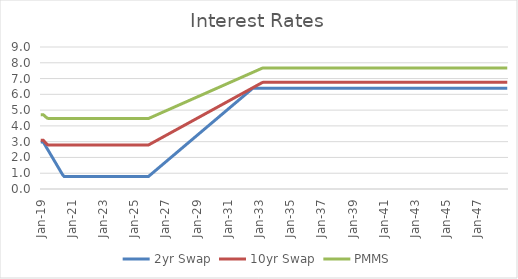
| Category | 2yr Swap | 10yr Swap | PMMS |
|---|---|---|---|
| 2019-01-31 | 2.979 | 3.089 | 4.71 |
| 2019-02-28 | 2.979 | 3.089 | 4.71 |
| 2019-03-31 | 2.979 | 3.089 | 4.71 |
| 2019-04-30 | 2.839 | 2.999 | 4.637 |
| 2019-05-31 | 2.7 | 2.908 | 4.564 |
| 2019-06-30 | 2.561 | 2.818 | 4.491 |
| 2019-07-31 | 2.421 | 2.792 | 4.47 |
| 2019-08-31 | 2.282 | 2.792 | 4.47 |
| 2019-09-30 | 2.143 | 2.792 | 4.47 |
| 2019-10-31 | 2.003 | 2.792 | 4.47 |
| 2019-11-30 | 1.864 | 2.792 | 4.47 |
| 2019-12-31 | 1.725 | 2.792 | 4.469 |
| 2020-01-31 | 1.585 | 2.792 | 4.469 |
| 2020-02-29 | 1.446 | 2.792 | 4.469 |
| 2020-03-31 | 1.307 | 2.792 | 4.469 |
| 2020-04-30 | 1.167 | 2.792 | 4.469 |
| 2020-05-31 | 1.028 | 2.792 | 4.469 |
| 2020-06-30 | 0.889 | 2.792 | 4.469 |
| 2020-07-31 | 0.798 | 2.792 | 4.469 |
| 2020-08-31 | 0.798 | 2.792 | 4.469 |
| 2020-09-30 | 0.798 | 2.792 | 4.469 |
| 2020-10-31 | 0.798 | 2.792 | 4.469 |
| 2020-11-30 | 0.798 | 2.792 | 4.469 |
| 2020-12-31 | 0.798 | 2.792 | 4.469 |
| 2021-01-31 | 0.798 | 2.792 | 4.469 |
| 2021-02-28 | 0.798 | 2.792 | 4.469 |
| 2021-03-31 | 0.798 | 2.792 | 4.469 |
| 2021-04-30 | 0.798 | 2.792 | 4.469 |
| 2021-05-31 | 0.798 | 2.792 | 4.469 |
| 2021-06-30 | 0.798 | 2.792 | 4.469 |
| 2021-07-31 | 0.798 | 2.792 | 4.469 |
| 2021-08-31 | 0.798 | 2.792 | 4.469 |
| 2021-09-30 | 0.798 | 2.792 | 4.469 |
| 2021-10-31 | 0.798 | 2.792 | 4.469 |
| 2021-11-30 | 0.798 | 2.792 | 4.469 |
| 2021-12-31 | 0.798 | 2.792 | 4.469 |
| 2022-01-31 | 0.798 | 2.792 | 4.469 |
| 2022-02-28 | 0.798 | 2.792 | 4.469 |
| 2022-03-31 | 0.798 | 2.792 | 4.469 |
| 2022-04-30 | 0.798 | 2.792 | 4.469 |
| 2022-05-31 | 0.798 | 2.792 | 4.469 |
| 2022-06-30 | 0.798 | 2.792 | 4.469 |
| 2022-07-31 | 0.798 | 2.792 | 4.469 |
| 2022-08-31 | 0.798 | 2.792 | 4.469 |
| 2022-09-30 | 0.798 | 2.792 | 4.469 |
| 2022-10-31 | 0.798 | 2.792 | 4.469 |
| 2022-11-30 | 0.798 | 2.792 | 4.469 |
| 2022-12-31 | 0.798 | 2.792 | 4.469 |
| 2023-01-31 | 0.798 | 2.792 | 4.469 |
| 2023-02-28 | 0.798 | 2.792 | 4.469 |
| 2023-03-31 | 0.798 | 2.792 | 4.469 |
| 2023-04-30 | 0.798 | 2.792 | 4.469 |
| 2023-05-31 | 0.798 | 2.792 | 4.469 |
| 2023-06-30 | 0.798 | 2.792 | 4.469 |
| 2023-07-31 | 0.798 | 2.792 | 4.469 |
| 2023-08-31 | 0.798 | 2.792 | 4.469 |
| 2023-09-30 | 0.798 | 2.792 | 4.469 |
| 2023-10-31 | 0.798 | 2.792 | 4.469 |
| 2023-11-30 | 0.798 | 2.792 | 4.469 |
| 2023-12-31 | 0.798 | 2.792 | 4.469 |
| 2024-01-31 | 0.798 | 2.792 | 4.469 |
| 2024-02-29 | 0.798 | 2.792 | 4.469 |
| 2024-03-31 | 0.798 | 2.792 | 4.469 |
| 2024-04-30 | 0.798 | 2.792 | 4.469 |
| 2024-05-31 | 0.798 | 2.792 | 4.469 |
| 2024-06-30 | 0.798 | 2.792 | 4.469 |
| 2024-07-31 | 0.798 | 2.792 | 4.469 |
| 2024-08-31 | 0.798 | 2.792 | 4.469 |
| 2024-09-30 | 0.798 | 2.792 | 4.469 |
| 2024-10-31 | 0.798 | 2.792 | 4.469 |
| 2024-11-30 | 0.798 | 2.792 | 4.469 |
| 2024-12-31 | 0.798 | 2.792 | 4.469 |
| 2025-01-31 | 0.798 | 2.792 | 4.469 |
| 2025-02-28 | 0.798 | 2.792 | 4.469 |
| 2025-03-31 | 0.798 | 2.792 | 4.469 |
| 2025-04-30 | 0.798 | 2.792 | 4.469 |
| 2025-05-31 | 0.798 | 2.792 | 4.469 |
| 2025-06-30 | 0.798 | 2.792 | 4.469 |
| 2025-07-31 | 0.798 | 2.792 | 4.469 |
| 2025-08-31 | 0.798 | 2.792 | 4.469 |
| 2025-09-30 | 0.798 | 2.792 | 4.469 |
| 2025-10-31 | 0.798 | 2.792 | 4.469 |
| 2025-11-30 | 0.798 | 2.792 | 4.469 |
| 2025-12-31 | 0.798 | 2.792 | 4.469 |
| 2026-01-31 | 0.868 | 2.837 | 4.505 |
| 2026-02-28 | 0.938 | 2.882 | 4.542 |
| 2026-03-31 | 1.007 | 2.928 | 4.578 |
| 2026-04-30 | 1.077 | 2.973 | 4.615 |
| 2026-05-31 | 1.147 | 3.018 | 4.651 |
| 2026-06-30 | 1.216 | 3.063 | 4.688 |
| 2026-07-31 | 1.286 | 3.108 | 4.724 |
| 2026-08-31 | 1.356 | 3.154 | 4.761 |
| 2026-09-30 | 1.425 | 3.199 | 4.797 |
| 2026-10-31 | 1.495 | 3.244 | 4.834 |
| 2026-11-30 | 1.565 | 3.289 | 4.87 |
| 2026-12-31 | 1.634 | 3.334 | 4.906 |
| 2027-01-31 | 1.704 | 3.38 | 4.943 |
| 2027-02-28 | 1.774 | 3.425 | 4.979 |
| 2027-03-31 | 1.843 | 3.47 | 5.016 |
| 2027-04-30 | 1.913 | 3.515 | 5.052 |
| 2027-05-31 | 1.983 | 3.561 | 5.089 |
| 2027-06-30 | 2.052 | 3.606 | 5.125 |
| 2027-07-31 | 2.122 | 3.651 | 5.162 |
| 2027-08-31 | 2.192 | 3.696 | 5.198 |
| 2027-09-30 | 2.261 | 3.741 | 5.235 |
| 2027-10-31 | 2.331 | 3.787 | 5.271 |
| 2027-11-30 | 2.401 | 3.832 | 5.308 |
| 2027-12-31 | 2.47 | 3.877 | 5.344 |
| 2028-01-31 | 2.54 | 3.922 | 5.381 |
| 2028-02-29 | 2.61 | 3.968 | 5.417 |
| 2028-03-31 | 2.679 | 4.013 | 5.454 |
| 2028-04-30 | 2.749 | 4.058 | 5.49 |
| 2028-05-31 | 2.819 | 4.103 | 5.527 |
| 2028-06-30 | 2.888 | 4.148 | 5.563 |
| 2028-07-31 | 2.958 | 4.194 | 5.6 |
| 2028-08-31 | 3.028 | 4.239 | 5.636 |
| 2028-09-30 | 3.097 | 4.284 | 5.673 |
| 2028-10-31 | 3.167 | 4.329 | 5.709 |
| 2028-11-30 | 3.237 | 4.375 | 5.746 |
| 2028-12-31 | 3.306 | 4.42 | 5.782 |
| 2029-01-31 | 3.376 | 4.465 | 5.818 |
| 2029-02-28 | 3.446 | 4.51 | 5.855 |
| 2029-03-31 | 3.515 | 4.555 | 5.891 |
| 2029-04-30 | 3.585 | 4.601 | 5.928 |
| 2029-05-31 | 3.655 | 4.646 | 5.964 |
| 2029-06-30 | 3.724 | 4.691 | 6.001 |
| 2029-07-31 | 3.794 | 4.736 | 6.037 |
| 2029-08-31 | 3.864 | 4.782 | 6.074 |
| 2029-09-30 | 3.933 | 4.827 | 6.11 |
| 2029-10-31 | 4.003 | 4.872 | 6.147 |
| 2029-11-30 | 4.073 | 4.917 | 6.183 |
| 2029-12-31 | 4.142 | 4.962 | 6.22 |
| 2030-01-31 | 4.212 | 5.008 | 6.256 |
| 2030-02-28 | 4.282 | 5.053 | 6.293 |
| 2030-03-31 | 4.351 | 5.098 | 6.329 |
| 2030-04-30 | 4.421 | 5.143 | 6.366 |
| 2030-05-31 | 4.491 | 5.189 | 6.402 |
| 2030-06-30 | 4.56 | 5.234 | 6.439 |
| 2030-07-31 | 4.63 | 5.279 | 6.475 |
| 2030-08-31 | 4.7 | 5.324 | 6.512 |
| 2030-09-30 | 4.769 | 5.369 | 6.548 |
| 2030-10-31 | 4.839 | 5.415 | 6.585 |
| 2030-11-30 | 4.909 | 5.46 | 6.621 |
| 2030-12-31 | 4.978 | 5.505 | 6.658 |
| 2031-01-31 | 5.048 | 5.55 | 6.694 |
| 2031-02-28 | 5.118 | 5.596 | 6.73 |
| 2031-03-31 | 5.187 | 5.641 | 6.767 |
| 2031-04-30 | 5.257 | 5.686 | 6.803 |
| 2031-05-31 | 5.327 | 5.731 | 6.84 |
| 2031-06-30 | 5.396 | 5.776 | 6.876 |
| 2031-07-31 | 5.466 | 5.822 | 6.913 |
| 2031-08-31 | 5.536 | 5.867 | 6.949 |
| 2031-09-30 | 5.605 | 5.912 | 6.986 |
| 2031-10-31 | 5.675 | 5.957 | 7.022 |
| 2031-11-30 | 5.745 | 6.003 | 7.059 |
| 2031-12-31 | 5.814 | 6.048 | 7.095 |
| 2032-01-31 | 5.884 | 6.093 | 7.132 |
| 2032-02-29 | 5.954 | 6.138 | 7.168 |
| 2032-03-31 | 6.023 | 6.183 | 7.205 |
| 2032-04-30 | 6.093 | 6.229 | 7.241 |
| 2032-05-31 | 6.163 | 6.274 | 7.278 |
| 2032-06-30 | 6.232 | 6.319 | 7.314 |
| 2032-07-31 | 6.302 | 6.364 | 7.351 |
| 2032-08-31 | 6.372 | 6.409 | 7.387 |
| 2032-09-30 | 6.387 | 6.455 | 7.424 |
| 2032-10-31 | 6.387 | 6.5 | 7.46 |
| 2032-11-30 | 6.387 | 6.545 | 7.496 |
| 2032-12-31 | 6.387 | 6.59 | 7.533 |
| 2033-01-31 | 6.387 | 6.636 | 7.569 |
| 2033-02-28 | 6.387 | 6.681 | 7.606 |
| 2033-03-31 | 6.387 | 6.726 | 7.642 |
| 2033-04-30 | 6.387 | 6.758 | 7.668 |
| 2033-05-31 | 6.387 | 6.758 | 7.668 |
| 2033-06-30 | 6.387 | 6.758 | 7.668 |
| 2033-07-31 | 6.387 | 6.758 | 7.668 |
| 2033-08-31 | 6.387 | 6.758 | 7.668 |
| 2033-09-30 | 6.387 | 6.758 | 7.668 |
| 2033-10-31 | 6.387 | 6.758 | 7.668 |
| 2033-11-30 | 6.387 | 6.758 | 7.668 |
| 2033-12-31 | 6.387 | 6.758 | 7.668 |
| 2034-01-31 | 6.387 | 6.758 | 7.668 |
| 2034-02-28 | 6.387 | 6.758 | 7.668 |
| 2034-03-31 | 6.387 | 6.758 | 7.668 |
| 2034-04-30 | 6.387 | 6.758 | 7.668 |
| 2034-05-31 | 6.387 | 6.758 | 7.668 |
| 2034-06-30 | 6.387 | 6.758 | 7.668 |
| 2034-07-31 | 6.387 | 6.758 | 7.668 |
| 2034-08-31 | 6.387 | 6.758 | 7.668 |
| 2034-09-30 | 6.387 | 6.758 | 7.668 |
| 2034-10-31 | 6.387 | 6.758 | 7.668 |
| 2034-11-30 | 6.387 | 6.758 | 7.668 |
| 2034-12-31 | 6.387 | 6.758 | 7.668 |
| 2035-01-31 | 6.387 | 6.758 | 7.668 |
| 2035-02-28 | 6.387 | 6.758 | 7.668 |
| 2035-03-31 | 6.387 | 6.758 | 7.668 |
| 2035-04-30 | 6.387 | 6.758 | 7.668 |
| 2035-05-31 | 6.387 | 6.758 | 7.668 |
| 2035-06-30 | 6.387 | 6.758 | 7.668 |
| 2035-07-31 | 6.387 | 6.758 | 7.668 |
| 2035-08-31 | 6.387 | 6.758 | 7.668 |
| 2035-09-30 | 6.387 | 6.758 | 7.668 |
| 2035-10-31 | 6.387 | 6.758 | 7.668 |
| 2035-11-30 | 6.387 | 6.758 | 7.668 |
| 2035-12-31 | 6.387 | 6.758 | 7.668 |
| 2036-01-31 | 6.387 | 6.758 | 7.668 |
| 2036-02-29 | 6.387 | 6.758 | 7.668 |
| 2036-03-31 | 6.387 | 6.758 | 7.668 |
| 2036-04-30 | 6.387 | 6.758 | 7.668 |
| 2036-05-31 | 6.387 | 6.758 | 7.668 |
| 2036-06-30 | 6.387 | 6.758 | 7.668 |
| 2036-07-31 | 6.387 | 6.758 | 7.668 |
| 2036-08-31 | 6.387 | 6.758 | 7.668 |
| 2036-09-30 | 6.387 | 6.758 | 7.668 |
| 2036-10-31 | 6.387 | 6.758 | 7.668 |
| 2036-11-30 | 6.387 | 6.758 | 7.668 |
| 2036-12-31 | 6.387 | 6.758 | 7.668 |
| 2037-01-31 | 6.387 | 6.758 | 7.668 |
| 2037-02-28 | 6.387 | 6.758 | 7.668 |
| 2037-03-31 | 6.387 | 6.758 | 7.668 |
| 2037-04-30 | 6.387 | 6.758 | 7.668 |
| 2037-05-31 | 6.387 | 6.758 | 7.668 |
| 2037-06-30 | 6.387 | 6.758 | 7.668 |
| 2037-07-31 | 6.387 | 6.758 | 7.668 |
| 2037-08-31 | 6.387 | 6.758 | 7.668 |
| 2037-09-30 | 6.387 | 6.758 | 7.668 |
| 2037-10-31 | 6.387 | 6.758 | 7.668 |
| 2037-11-30 | 6.387 | 6.758 | 7.668 |
| 2037-12-31 | 6.387 | 6.758 | 7.668 |
| 2038-01-31 | 6.387 | 6.758 | 7.668 |
| 2038-02-28 | 6.387 | 6.758 | 7.668 |
| 2038-03-31 | 6.387 | 6.758 | 7.668 |
| 2038-04-30 | 6.387 | 6.758 | 7.668 |
| 2038-05-31 | 6.387 | 6.758 | 7.668 |
| 2038-06-30 | 6.387 | 6.758 | 7.668 |
| 2038-07-31 | 6.387 | 6.758 | 7.668 |
| 2038-08-31 | 6.387 | 6.758 | 7.668 |
| 2038-09-30 | 6.387 | 6.758 | 7.668 |
| 2038-10-31 | 6.387 | 6.758 | 7.668 |
| 2038-11-30 | 6.387 | 6.758 | 7.668 |
| 2038-12-31 | 6.387 | 6.758 | 7.668 |
| 2039-01-31 | 6.387 | 6.758 | 7.668 |
| 2039-02-28 | 6.387 | 6.758 | 7.668 |
| 2039-03-31 | 6.387 | 6.758 | 7.668 |
| 2039-04-30 | 6.387 | 6.758 | 7.668 |
| 2039-05-31 | 6.387 | 6.758 | 7.668 |
| 2039-06-30 | 6.387 | 6.758 | 7.668 |
| 2039-07-31 | 6.387 | 6.758 | 7.668 |
| 2039-08-31 | 6.387 | 6.758 | 7.668 |
| 2039-09-30 | 6.387 | 6.758 | 7.668 |
| 2039-10-31 | 6.387 | 6.758 | 7.668 |
| 2039-11-30 | 6.387 | 6.758 | 7.668 |
| 2039-12-31 | 6.387 | 6.758 | 7.668 |
| 2040-01-31 | 6.387 | 6.758 | 7.668 |
| 2040-02-29 | 6.387 | 6.758 | 7.668 |
| 2040-03-31 | 6.387 | 6.758 | 7.668 |
| 2040-04-30 | 6.387 | 6.758 | 7.668 |
| 2040-05-31 | 6.387 | 6.758 | 7.668 |
| 2040-06-30 | 6.387 | 6.758 | 7.668 |
| 2040-07-31 | 6.387 | 6.758 | 7.668 |
| 2040-08-31 | 6.387 | 6.758 | 7.668 |
| 2040-09-30 | 6.387 | 6.758 | 7.668 |
| 2040-10-31 | 6.387 | 6.758 | 7.668 |
| 2040-11-30 | 6.387 | 6.758 | 7.668 |
| 2040-12-31 | 6.387 | 6.758 | 7.668 |
| 2041-01-31 | 6.387 | 6.758 | 7.668 |
| 2041-02-28 | 6.387 | 6.758 | 7.668 |
| 2041-03-31 | 6.387 | 6.758 | 7.668 |
| 2041-04-30 | 6.387 | 6.758 | 7.668 |
| 2041-05-31 | 6.387 | 6.758 | 7.668 |
| 2041-06-30 | 6.387 | 6.758 | 7.668 |
| 2041-07-31 | 6.387 | 6.758 | 7.668 |
| 2041-08-31 | 6.387 | 6.758 | 7.668 |
| 2041-09-30 | 6.387 | 6.758 | 7.668 |
| 2041-10-31 | 6.387 | 6.758 | 7.668 |
| 2041-11-30 | 6.387 | 6.758 | 7.668 |
| 2041-12-31 | 6.387 | 6.758 | 7.668 |
| 2042-01-31 | 6.387 | 6.758 | 7.668 |
| 2042-02-28 | 6.387 | 6.758 | 7.668 |
| 2042-03-31 | 6.387 | 6.758 | 7.668 |
| 2042-04-30 | 6.387 | 6.758 | 7.668 |
| 2042-05-31 | 6.387 | 6.758 | 7.668 |
| 2042-06-30 | 6.387 | 6.758 | 7.668 |
| 2042-07-31 | 6.387 | 6.758 | 7.668 |
| 2042-08-31 | 6.387 | 6.758 | 7.668 |
| 2042-09-30 | 6.387 | 6.758 | 7.668 |
| 2042-10-31 | 6.387 | 6.758 | 7.668 |
| 2042-11-30 | 6.387 | 6.758 | 7.668 |
| 2042-12-31 | 6.387 | 6.758 | 7.668 |
| 2043-01-31 | 6.387 | 6.758 | 7.668 |
| 2043-02-28 | 6.387 | 6.758 | 7.668 |
| 2043-03-31 | 6.387 | 6.758 | 7.668 |
| 2043-04-30 | 6.387 | 6.758 | 7.668 |
| 2043-05-31 | 6.387 | 6.758 | 7.668 |
| 2043-06-30 | 6.387 | 6.758 | 7.668 |
| 2043-07-31 | 6.387 | 6.758 | 7.668 |
| 2043-08-31 | 6.387 | 6.758 | 7.668 |
| 2043-09-30 | 6.387 | 6.758 | 7.668 |
| 2043-10-31 | 6.387 | 6.758 | 7.668 |
| 2043-11-30 | 6.387 | 6.758 | 7.668 |
| 2043-12-31 | 6.387 | 6.758 | 7.668 |
| 2044-01-31 | 6.387 | 6.758 | 7.668 |
| 2044-02-29 | 6.387 | 6.758 | 7.668 |
| 2044-03-31 | 6.387 | 6.758 | 7.668 |
| 2044-04-30 | 6.387 | 6.758 | 7.668 |
| 2044-05-31 | 6.387 | 6.758 | 7.668 |
| 2044-06-30 | 6.387 | 6.758 | 7.668 |
| 2044-07-31 | 6.387 | 6.758 | 7.668 |
| 2044-08-31 | 6.387 | 6.758 | 7.668 |
| 2044-09-30 | 6.387 | 6.758 | 7.668 |
| 2044-10-31 | 6.387 | 6.758 | 7.668 |
| 2044-11-30 | 6.387 | 6.758 | 7.668 |
| 2044-12-31 | 6.387 | 6.758 | 7.668 |
| 2045-01-31 | 6.387 | 6.758 | 7.668 |
| 2045-02-28 | 6.387 | 6.758 | 7.668 |
| 2045-03-31 | 6.387 | 6.758 | 7.668 |
| 2045-04-30 | 6.387 | 6.758 | 7.668 |
| 2045-05-31 | 6.387 | 6.758 | 7.668 |
| 2045-06-30 | 6.387 | 6.758 | 7.668 |
| 2045-07-31 | 6.387 | 6.758 | 7.668 |
| 2045-08-31 | 6.387 | 6.758 | 7.668 |
| 2045-09-30 | 6.387 | 6.758 | 7.668 |
| 2045-10-31 | 6.387 | 6.758 | 7.668 |
| 2045-11-30 | 6.387 | 6.758 | 7.668 |
| 2045-12-31 | 6.387 | 6.758 | 7.668 |
| 2046-01-31 | 6.387 | 6.758 | 7.668 |
| 2046-02-28 | 6.387 | 6.758 | 7.668 |
| 2046-03-31 | 6.387 | 6.758 | 7.668 |
| 2046-04-30 | 6.387 | 6.758 | 7.668 |
| 2046-05-31 | 6.387 | 6.758 | 7.668 |
| 2046-06-30 | 6.387 | 6.758 | 7.668 |
| 2046-07-31 | 6.387 | 6.758 | 7.668 |
| 2046-08-31 | 6.387 | 6.758 | 7.668 |
| 2046-09-30 | 6.387 | 6.758 | 7.668 |
| 2046-10-31 | 6.387 | 6.758 | 7.668 |
| 2046-11-30 | 6.387 | 6.758 | 7.668 |
| 2046-12-31 | 6.387 | 6.758 | 7.668 |
| 2047-01-31 | 6.387 | 6.758 | 7.668 |
| 2047-02-28 | 6.387 | 6.758 | 7.668 |
| 2047-03-31 | 6.387 | 6.758 | 7.668 |
| 2047-04-30 | 6.387 | 6.758 | 7.668 |
| 2047-05-31 | 6.387 | 6.758 | 7.668 |
| 2047-06-30 | 6.387 | 6.758 | 7.668 |
| 2047-07-31 | 6.387 | 6.758 | 7.668 |
| 2047-08-31 | 6.387 | 6.758 | 7.668 |
| 2047-09-30 | 6.387 | 6.758 | 7.668 |
| 2047-10-31 | 6.387 | 6.758 | 7.668 |
| 2047-11-30 | 6.387 | 6.758 | 7.668 |
| 2047-12-31 | 6.387 | 6.758 | 7.668 |
| 2048-01-31 | 6.387 | 6.758 | 7.668 |
| 2048-02-29 | 6.387 | 6.758 | 7.668 |
| 2048-03-31 | 6.387 | 6.758 | 7.668 |
| 2048-04-30 | 6.387 | 6.758 | 7.668 |
| 2048-05-31 | 6.387 | 6.758 | 7.668 |
| 2048-06-30 | 6.387 | 6.758 | 7.668 |
| 2048-07-31 | 6.387 | 6.758 | 7.668 |
| 2048-08-31 | 6.387 | 6.758 | 7.668 |
| 2048-09-30 | 6.387 | 6.758 | 7.668 |
| 2048-10-31 | 6.387 | 6.758 | 7.668 |
| 2048-11-30 | 6.387 | 6.758 | 7.668 |
| 2048-12-31 | 6.387 | 6.758 | 7.668 |